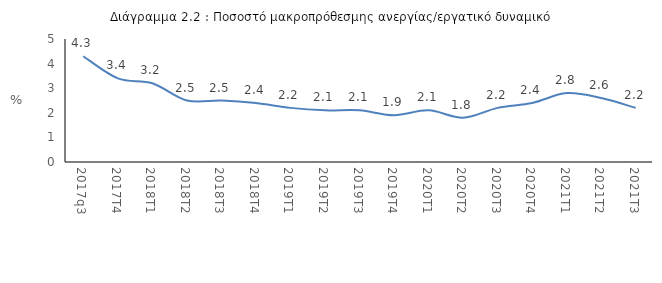
| Category | Series 0 |
|---|---|
| 2017q3 | 4.3 |
| 2017Τ4 | 3.4 |
| 2018Τ1 | 3.2 |
| 2018Τ2 | 2.5 |
| 2018Τ3 | 2.5 |
| 2018Τ4 | 2.4 |
| 2019Τ1 | 2.2 |
| 2019Τ2 | 2.1 |
| 2019Τ3 | 2.1 |
| 2019Τ4 | 1.9 |
| 2020Τ1 | 2.1 |
| 2020Τ2 | 1.8 |
| 2020Τ3 | 2.2 |
| 2020Τ4 | 2.4 |
| 2021Τ1 | 2.8 |
| 2021Τ2 | 2.6 |
| 2021Τ3 | 2.2 |